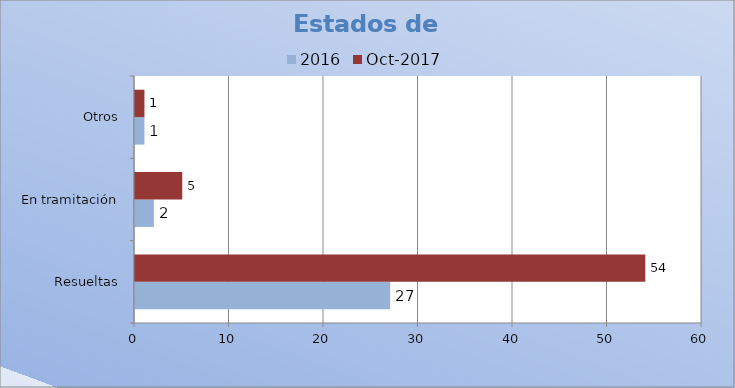
| Category | 2016 | oct-2017 |
|---|---|---|
| Resueltas | 27 | 54 |
| En tramitación | 2 | 5 |
| Otros | 1 | 1 |